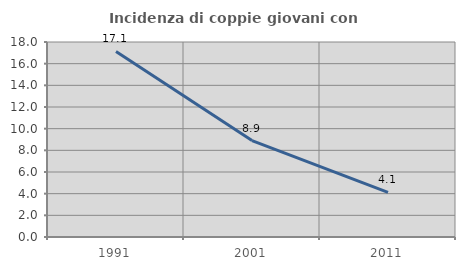
| Category | Incidenza di coppie giovani con figli |
|---|---|
| 1991.0 | 17.124 |
| 2001.0 | 8.9 |
| 2011.0 | 4.122 |